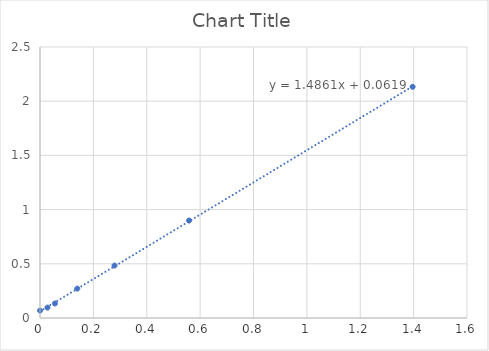
| Category | Series 0 |
|---|---|
| 0.0 | 0.068 |
| 0.027925 | 0.096 |
| 0.05585 | 0.134 |
| 0.139625 | 0.271 |
| 0.27925 | 0.484 |
| 0.5585 | 0.899 |
| 1.39625 | 2.133 |